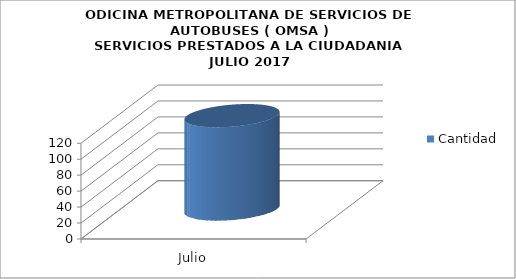
| Category | Cantidad |
|---|---|
| 0 | 117 |